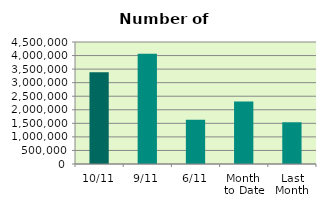
| Category | Series 0 |
|---|---|
| 10/11 | 3382152 |
| 9/11 | 4068324 |
| 6/11 | 1630504 |
| Month 
to Date | 2304556.571 |
| Last
Month | 1538680.909 |